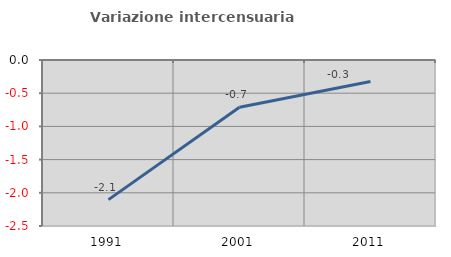
| Category | Variazione intercensuaria annua |
|---|---|
| 1991.0 | -2.103 |
| 2001.0 | -0.713 |
| 2011.0 | -0.324 |